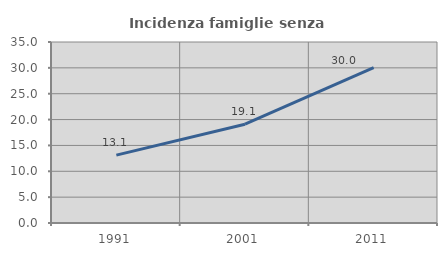
| Category | Incidenza famiglie senza nuclei |
|---|---|
| 1991.0 | 13.128 |
| 2001.0 | 19.109 |
| 2011.0 | 30.042 |